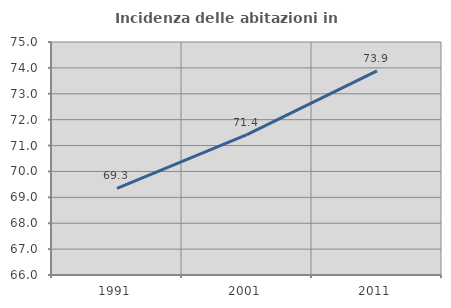
| Category | Incidenza delle abitazioni in proprietà  |
|---|---|
| 1991.0 | 69.343 |
| 2001.0 | 71.422 |
| 2011.0 | 73.883 |